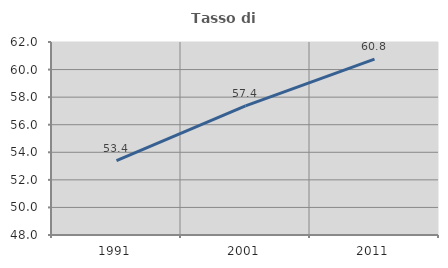
| Category | Tasso di occupazione   |
|---|---|
| 1991.0 | 53.399 |
| 2001.0 | 57.363 |
| 2011.0 | 60.753 |